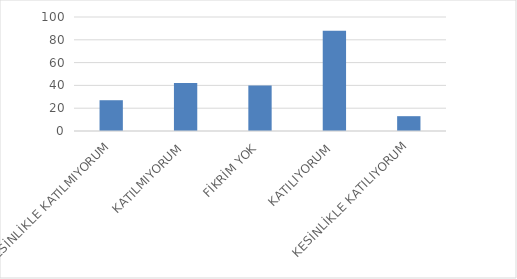
| Category | Series 0 |
|---|---|
| KESİNLİKLE KATILMIYORUM | 27 |
| KATILMIYORUM | 42 |
| FİKRİM YOK | 40 |
| KATILIYORUM | 88 |
| KESİNLİKLE KATILIYORUM | 13 |